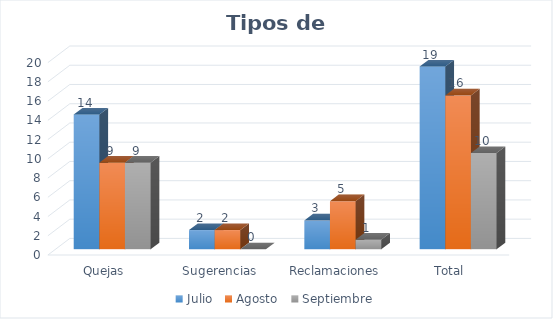
| Category | Julio  | Agosto  | Septiembre |
|---|---|---|---|
| Quejas | 14 | 9 | 9 |
| Sugerencias | 2 | 2 | 0 |
| Reclamaciones | 3 | 5 | 1 |
| Total | 19 | 16 | 10 |